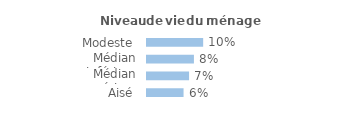
| Category | Series 0 |
|---|---|
| Modeste | 0.1 |
| Médian inférieur | 0.083 |
| Médian supérieur | 0.075 |
| Aisé | 0.065 |